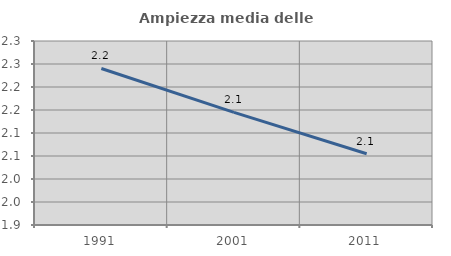
| Category | Ampiezza media delle famiglie |
|---|---|
| 1991.0 | 2.24 |
| 2001.0 | 2.145 |
| 2011.0 | 2.055 |